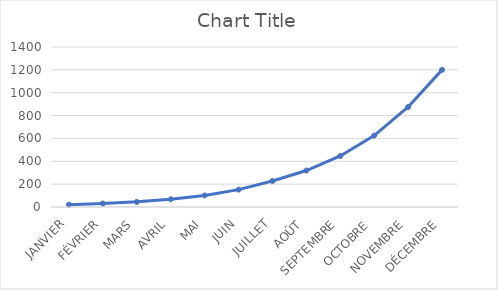
| Category | Series 0 |
|---|---|
| JANVIER | 20 |
| FÉVRIER | 30 |
| MARS | 45 |
| AVRIL | 67.5 |
| MAI | 101.25 |
| JUIN | 151.875 |
| JUILLET | 227.812 |
| AOÛT | 318.938 |
| SEPTEMBRE | 446.512 |
| OCTOBRE | 625.118 |
| NOVEMBRE | 875.164 |
| DÉCEMBRE | 1199.851 |